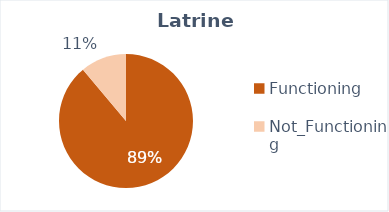
| Category | Series 0 |
|---|---|
| Functioning | 5256 |
| Not_Functioning | 656 |